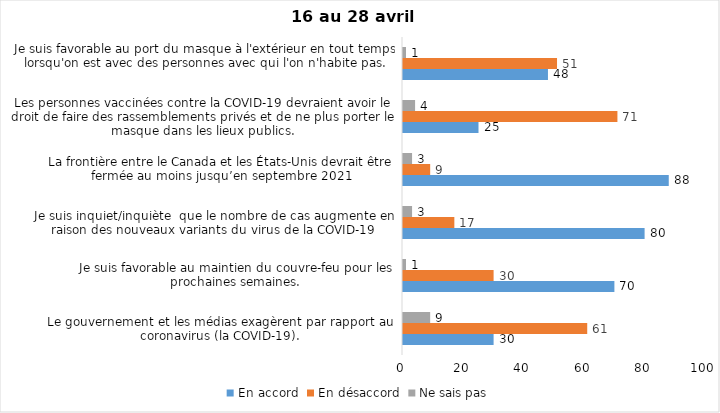
| Category | En accord | En désaccord | Ne sais pas |
|---|---|---|---|
| Le gouvernement et les médias exagèrent par rapport au coronavirus (la COVID-19). | 30 | 61 | 9 |
| Je suis favorable au maintien du couvre-feu pour les prochaines semaines. | 70 | 30 | 1 |
| Je suis inquiet/inquiète  que le nombre de cas augmente en raison des nouveaux variants du virus de la COVID-19 | 80 | 17 | 3 |
| La frontière entre le Canada et les États-Unis devrait être fermée au moins jusqu’en septembre 2021 | 88 | 9 | 3 |
| Les personnes vaccinées contre la COVID-19 devraient avoir le droit de faire des rassemblements privés et de ne plus porter le masque dans les lieux publics. | 25 | 71 | 4 |
| Je suis favorable au port du masque à l'extérieur en tout temps lorsqu'on est avec des personnes avec qui l'on n'habite pas. | 48 | 51 | 1 |